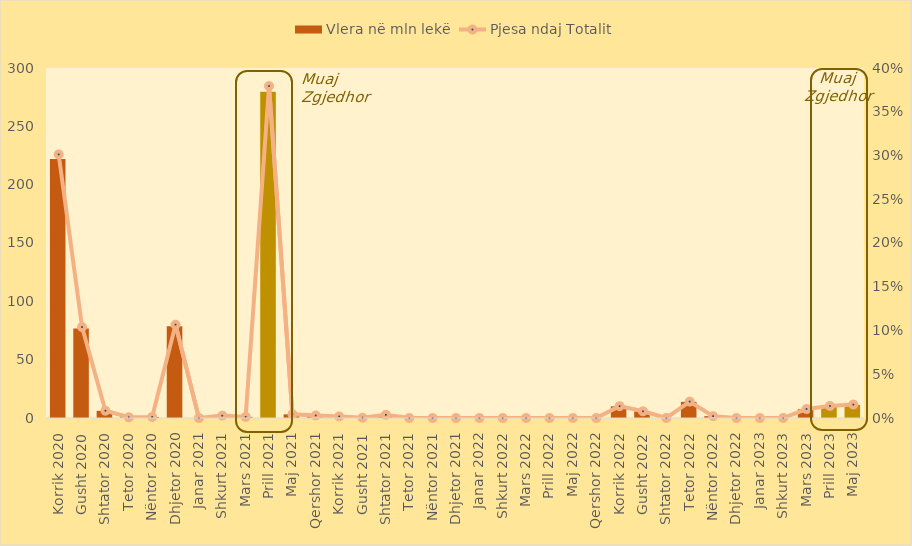
| Category | Vlera në mln lekë |
|---|---|
| Korrik 2020 | 222.05 |
| Gusht 2020 | 76.65 |
| Shtator 2020 | 6.15 |
| Tetor 2020 | 0.6 |
| Nëntor 2020 | 0.85 |
| Dhjetor 2020 | 78.65 |
| Janar 2021 | 0 |
| Shkurt 2021 | 2 |
| Mars 2021 | 0.95 |
| Prill 2021 | 279.679 |
| Maj 2021 | 3.155 |
| Qershor 2021 | 2.155 |
| Korrik 2021 | 1.342 |
| Gusht 2021 | 0.25 |
| Shtator 2021 | 2.655 |
| Tetor 2021 | 0 |
| Nëntor 2021 | 0 |
| Dhjetor 2021 | 0 |
| Janar 2022 | 0 |
| Shkurt 2022 | 0 |
| Mars 2022 | 0 |
| Prill 2022 | 0 |
| Maj 2022 | 0 |
| Qershor 2022 | 0 |
| Korrik 2022 | 9.986 |
| Gusht 2022 | 5.651 |
| Shtator 2022 | 0 |
| Tetor 2022 | 13.821 |
| Nëntor 2022 | 1.568 |
| Dhjetor 2022 | 0 |
| Janar 2023 | 0 |
| Shkurt 2023 | 0 |
| Mars 2023 | 7.57 |
| Prill 2023 | 10.159 |
| Maj 2023 | 11.3 |